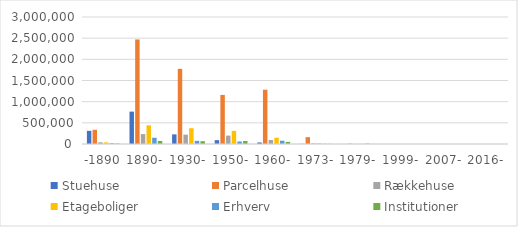
| Category | Stuehuse | Parcelhuse | Rækkehuse | Etageboliger | Erhverv | Institutioner |
|---|---|---|---|---|---|---|
| -1890 | 310852.053 | 335056.042 | 40430.992 | 38128.108 | 19410.621 | 12080.002 |
| 1890- | 764914.288 | 2469150.936 | 234171.658 | 441041.695 | 147789.584 | 71631.242 |
| 1930- | 227170.334 | 1774350.085 | 220367.26 | 372673.608 | 74208.802 | 65785.533 |
| 1950- | 90979.568 | 1159518.006 | 198059.99 | 310489.905 | 58717.002 | 70763.71 |
| 1960- | 36250.926 | 1282175.364 | 94836.053 | 147303.613 | 77666.453 | 50366.223 |
| 1973- | 3447.423 | 161681.789 | 14977.308 | 18582.442 | 4062.187 | 3440.65 |
| 1979- | 349.651 | 8595.719 | 2338.012 | 4365.112 | 9019.054 | 1230.558 |
| 1999- | 0 | 930.401 | 0 | 70.149 | 0 | 0 |
| 2007- | 0 | 591.291 | 0 | 0 | 353.045 | 0 |
| 2016- | 0 | 0 | 0 | 0 | 0 | 0 |